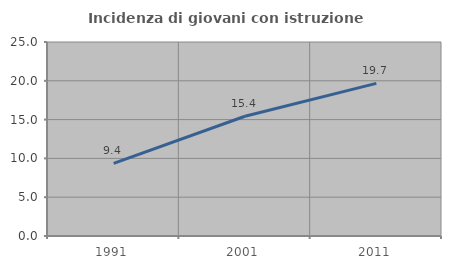
| Category | Incidenza di giovani con istruzione universitaria |
|---|---|
| 1991.0 | 9.354 |
| 2001.0 | 15.433 |
| 2011.0 | 19.668 |